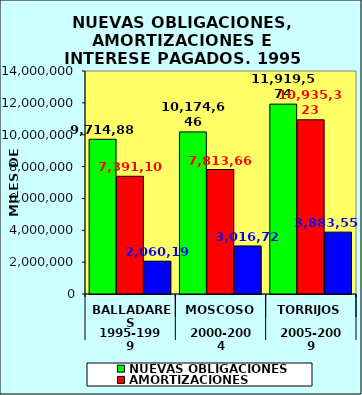
| Category | NUEVAS OBLIGACIONES | AMORTIZACIONES | INTERESES PAGADOS |
|---|---|---|---|
| 0 | 9714881 | 7391108 | 2060198 |
| 1 | 10174646 | 7813666 | 3016720 |
| 2 | 11919574 | 10935323 | 3883555 |